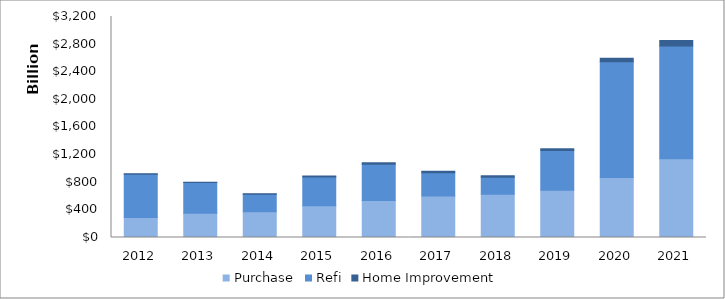
| Category | Purchase | Refi | Home Improvement |
|---|---|---|---|
| 2012.0 | 290055189677 | 626677758811 | 7393823646 |
| 2013.0 | 350218892695 | 444438330207 | 7112161775 |
| 2014.0 | 372353495048 | 254601193542 | 6773007232 |
| 2015.0 | 461162629670 | 416105861841 | 11996744688 |
| 2016.0 | 534386689978 | 526580019527 | 19895720920 |
| 2017.0 | 601770589007 | 335831966327 | 21077588707 |
| 2018.0 | 626842099188 | 244762344503 | 23214458316 |
| 2019.0 | 684578788668 | 574050967304 | 26338259301 |
| 2020.0 | 870054892481 | 1675143698989 | 49601589434 |
| 2021.0 | 1139311342316 | 1632286453181 | 80593149378 |